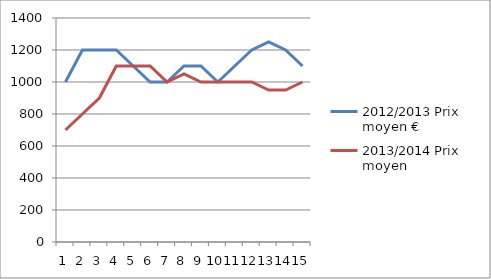
| Category | 2012/2013 Prix moyen € | 2013/2014 Prix moyen |
|---|---|---|
| 0 | 1000 | 700 |
| 1 | 1200 | 800 |
| 2 | 1200 | 900 |
| 3 | 1200 | 1100 |
| 4 | 1100 | 1100 |
| 5 | 1000 | 1100 |
| 6 | 1000 | 1000 |
| 7 | 1100 | 1050 |
| 8 | 1100 | 1000 |
| 9 | 1000 | 1000 |
| 10 | 1100 | 1000 |
| 11 | 1200 | 1000 |
| 12 | 1250 | 950 |
| 13 | 1200 | 950 |
| 14 | 1100 | 1000 |